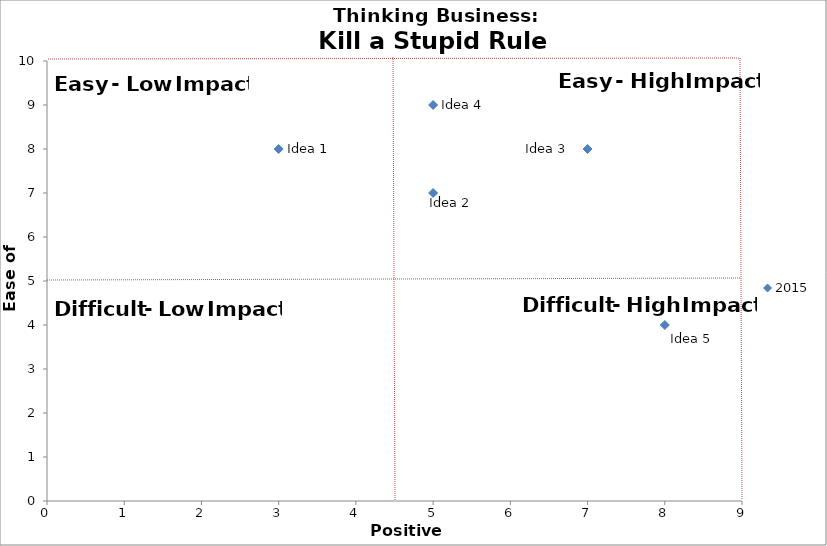
| Category | 2015 |
|---|---|
| 3.0 | 8 |
| 5.0 | 7 |
| 7.0 | 8 |
| 5.0 | 9 |
| 8.0 | 4 |